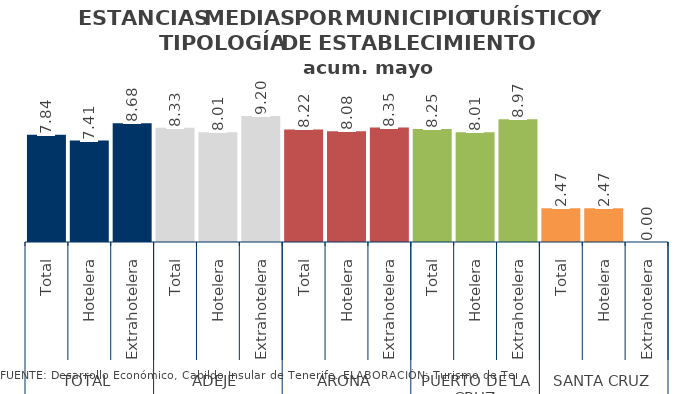
| Category | Series 2 |
|---|---|
| 0 | 7.835 |
| 1 | 7.407 |
| 2 | 8.676 |
| 3 | 8.333 |
| 4 | 8.007 |
| 5 | 9.197 |
| 6 | 8.216 |
| 7 | 8.083 |
| 8 | 8.35 |
| 9 | 8.254 |
| 10 | 8.009 |
| 11 | 8.967 |
| 12 | 2.471 |
| 13 | 2.471 |
| 14 | 0 |